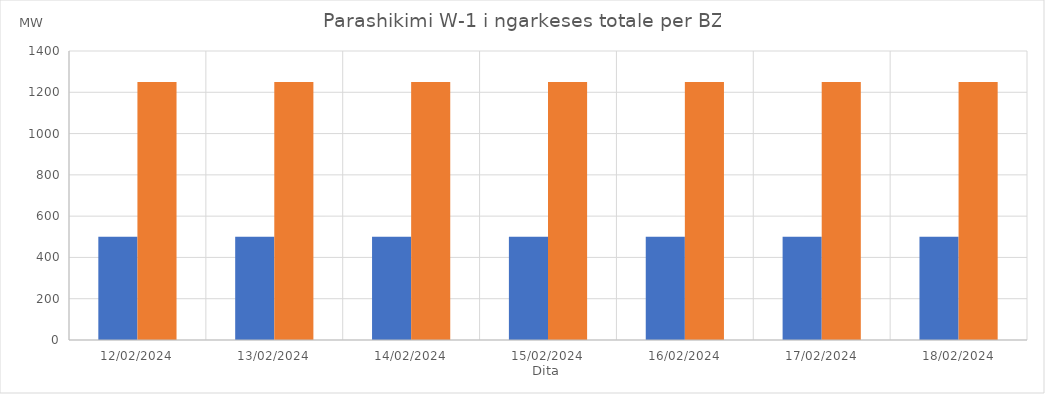
| Category | Min (MW) | Max (MW) |
|---|---|---|
| 12/02/2024 | 500 | 1250 |
| 13/02/2024 | 500 | 1250 |
| 14/02/2024 | 500 | 1250 |
| 15/02/2024 | 500 | 1250 |
| 16/02/2024 | 500 | 1250 |
| 17/02/2024 | 500 | 1250 |
| 18/02/2024 | 500 | 1250 |